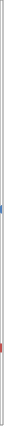
| Category | Nombre de demandes ayant au moins 1 jour sur le mois |
|---|---|
| 2020-03-01 | 1109000 |
| 2020-04-01 | 1240000 |
| 2020-05-01 | 1280000 |
| 2020-06-01 | 1145000 |